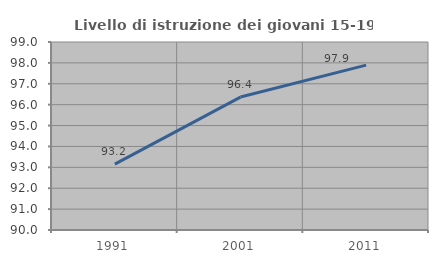
| Category | Livello di istruzione dei giovani 15-19 anni |
|---|---|
| 1991.0 | 93.156 |
| 2001.0 | 96.364 |
| 2011.0 | 97.895 |